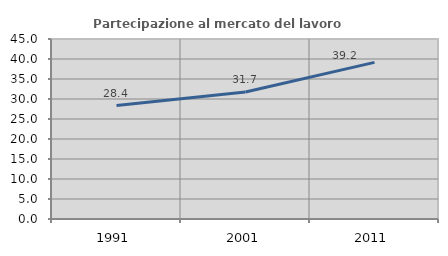
| Category | Partecipazione al mercato del lavoro  femminile |
|---|---|
| 1991.0 | 28.364 |
| 2001.0 | 31.739 |
| 2011.0 | 39.162 |